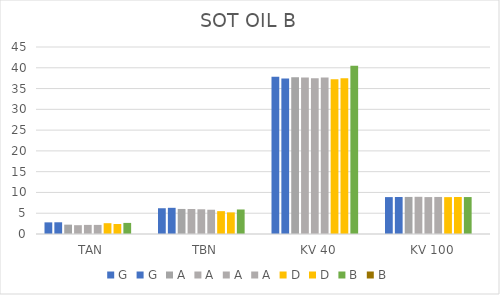
| Category | G | A | D | B |
|---|---|---|---|---|
| TAN | 2.82 | 2.19 | 2.4 |  |
| TBN | 6.3 | 5.84 | 5.2 |  |
| KV 40 | 37.42 | 37.68 | 37.46 |  |
| KV 100 | 8.9 | 8.915 | 8.901 |  |